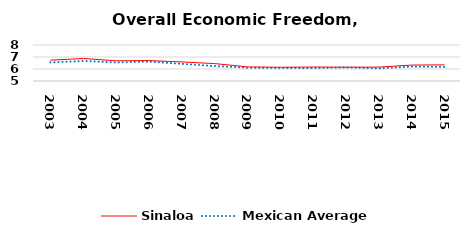
| Category | Sinaloa | Mexican Average  |
|---|---|---|
| 2003.0 | 6.736 | 6.552 |
| 2004.0 | 6.876 | 6.668 |
| 2005.0 | 6.682 | 6.546 |
| 2006.0 | 6.702 | 6.619 |
| 2007.0 | 6.588 | 6.428 |
| 2008.0 | 6.452 | 6.248 |
| 2009.0 | 6.176 | 6.106 |
| 2010.0 | 6.145 | 6.086 |
| 2011.0 | 6.164 | 6.074 |
| 2012.0 | 6.149 | 6.134 |
| 2013.0 | 6.156 | 6.054 |
| 2014.0 | 6.328 | 6.2 |
| 2015.0 | 6.344 | 6.174 |